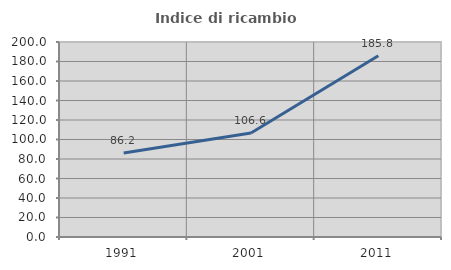
| Category | Indice di ricambio occupazionale  |
|---|---|
| 1991.0 | 86.17 |
| 2001.0 | 106.641 |
| 2011.0 | 185.833 |